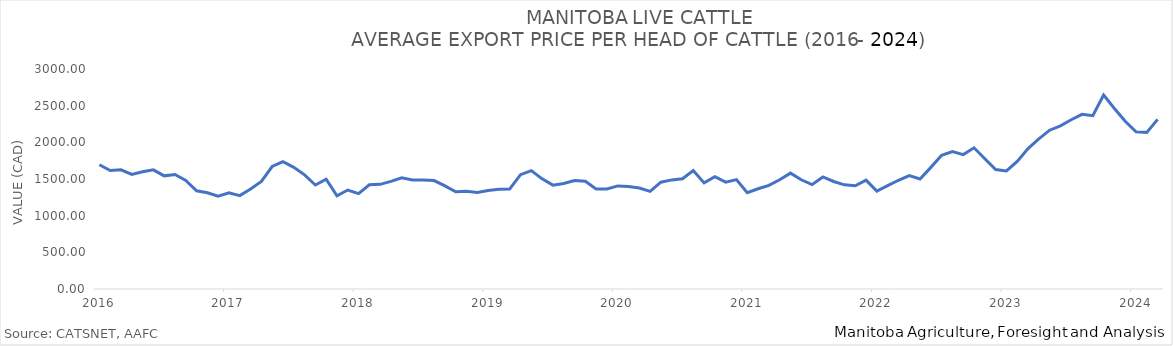
| Category | Total Cattle P |
|---|---|
| 2016-01-01 | 1693.831 |
| 2016-02-01 | 1615.24 |
| 2016-03-01 | 1624.43 |
| 2016-04-01 | 1563.43 |
| 2016-05-01 | 1599.414 |
| 2016-06-01 | 1624.519 |
| 2016-07-01 | 1542.974 |
| 2016-08-01 | 1561.843 |
| 2016-09-01 | 1481.102 |
| 2016-10-01 | 1339.016 |
| 2016-11-01 | 1312.88 |
| 2016-12-01 | 1265.566 |
| 2017-01-01 | 1310.673 |
| 2017-02-01 | 1273.713 |
| 2017-03-01 | 1362.561 |
| 2017-04-01 | 1466.192 |
| 2017-05-01 | 1670.369 |
| 2017-06-01 | 1736.551 |
| 2017-07-01 | 1659.574 |
| 2017-08-01 | 1556.616 |
| 2017-09-01 | 1417.754 |
| 2017-10-01 | 1497.78 |
| 2017-11-01 | 1270.68 |
| 2017-12-01 | 1349.417 |
| 2018-01-01 | 1301.272 |
| 2018-02-01 | 1421.801 |
| 2018-03-01 | 1426.738 |
| 2018-04-01 | 1468.174 |
| 2018-05-01 | 1515.145 |
| 2018-06-01 | 1486.388 |
| 2018-07-01 | 1486.406 |
| 2018-08-01 | 1478.497 |
| 2018-09-01 | 1406.464 |
| 2018-10-01 | 1325.978 |
| 2018-11-01 | 1333.367 |
| 2018-12-01 | 1317.49 |
| 2019-01-01 | 1343.2 |
| 2019-02-01 | 1361.669 |
| 2019-03-01 | 1364.428 |
| 2019-04-01 | 1559.568 |
| 2019-05-01 | 1613.501 |
| 2019-06-01 | 1501.805 |
| 2019-07-01 | 1416.037 |
| 2019-08-01 | 1439.377 |
| 2019-09-01 | 1478.4 |
| 2019-10-01 | 1469.706 |
| 2019-11-01 | 1364.128 |
| 2019-12-01 | 1365.114 |
| 2020-01-01 | 1405.991 |
| 2020-02-01 | 1398.961 |
| 2020-03-01 | 1377.358 |
| 2020-04-01 | 1330.925 |
| 2020-05-01 | 1456.821 |
| 2020-06-01 | 1487.768 |
| 2020-07-01 | 1502.643 |
| 2020-08-01 | 1615.227 |
| 2020-09-01 | 1447.121 |
| 2020-10-01 | 1531.009 |
| 2020-11-01 | 1457.158 |
| 2020-12-01 | 1492.219 |
| 2021-01-01 | 1314.19 |
| 2021-02-01 | 1367.038 |
| 2021-03-01 | 1412.154 |
| 2021-04-01 | 1489.614 |
| 2021-05-01 | 1580.267 |
| 2021-06-01 | 1489.155 |
| 2021-07-01 | 1423.62 |
| 2021-08-01 | 1527.702 |
| 2021-09-01 | 1466.038 |
| 2021-10-01 | 1420.761 |
| 2021-11-01 | 1407.086 |
| 2021-12-01 | 1484.79 |
| 2022-01-01 | 1335.457 |
| 2022-02-01 | 1410.72 |
| 2022-03-01 | 1482.935 |
| 2022-04-01 | 1545.55 |
| 2022-05-01 | 1499.459 |
| 2022-06-01 | 1658.417 |
| 2022-07-01 | 1823.76 |
| 2022-08-01 | 1875.399 |
| 2022-09-01 | 1832.672 |
| 2022-10-01 | 1925.165 |
| 2022-11-01 | 1775.625 |
| 2022-12-01 | 1628.02 |
| 2023-01-01 | 1609.373 |
| 2023-02-01 | 1739.635 |
| 2023-03-01 | 1915.44 |
| 2023-04-01 | 2046.784 |
| 2023-05-01 | 2165.437 |
| 2023-06-01 | 2224.783 |
| 2023-07-01 | 2308.498 |
| 2023-08-01 | 2381.37 |
| 2023-09-01 | 2364.173 |
| 2023-10-01 | 2644.838 |
| 2023-11-01 | 2461.82 |
| 2023-12-01 | 2287.43 |
| 2024-01-01 | 2142.388 |
| 2024-02-01 | 2135.917 |
| 2024-03-01 | 2313.164 |